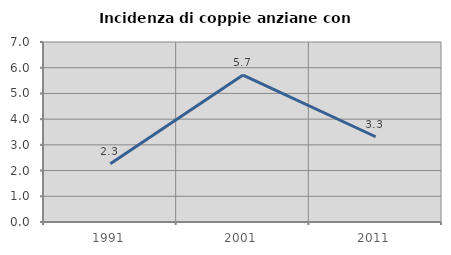
| Category | Incidenza di coppie anziane con figli |
|---|---|
| 1991.0 | 2.262 |
| 2001.0 | 5.714 |
| 2011.0 | 3.315 |